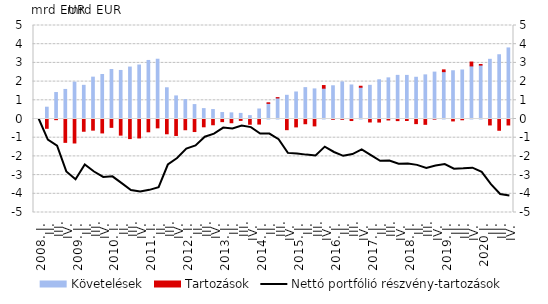
| Category | Követelések | Tartozások |
|---|---|---|
| 2008. I. | 0 | 0 |
|          II. | 0.631 | -0.498 |
|          III. | 1.415 | -0.036 |
|          IV. | 1.581 | -1.249 |
| 2009. I. | 1.969 | -1.283 |
|          II. | 1.8 | -0.655 |
|          III. | 2.238 | -0.596 |
|          IV. | 2.378 | -0.745 |
| 2010. I. | 2.646 | -0.447 |
|          II. | 2.595 | -0.863 |
|          III. | 2.778 | -1.048 |
|          IV. | 2.887 | -1.014 |
| 2011. I. | 3.131 | -0.684 |
|          II. | 3.196 | -0.473 |
|          III. | 1.669 | -0.79 |
|          IV. | 1.235 | -0.881 |
| 2012. I. | 1.037 | -0.575 |
|          II. | 0.771 | -0.671 |
|          III. | 0.556 | -0.417 |
|          IV. | 0.505 | -0.308 |
| 2013. I. | 0.346 | -0.141 |
| II. | 0.328 | -0.2 |
|          III. | 0.299 | -0.075 |
| IV. | 0.181 | -0.281 |
| 2014. I. | 0.534 | -0.271 |
| II. | 0.835 | 0.031 |
|          III. | 1.126 | 0.016 |
| IV. | 1.267 | -0.571 |
| 2015. I. | 1.445 | -0.423 |
| II. | 1.678 | -0.254 |
|          III. | 1.609 | -0.369 |
| IV. | 1.647 | 0.142 |
| 2016. I. | 1.776 | -0.014 |
| II. | 1.981 | -0.014 |
|          III. | 1.819 | -0.082 |
| IV. | 1.699 | 0.052 |
| 2017. I. | 1.801 | -0.159 |
| II. | 2.097 | -0.164 |
|          III. | 2.2 | -0.052 |
| IV. | 2.333 | -0.087 |
| 2018. I. | 2.331 | -0.079 |
| II. | 2.232 | -0.248 |
|          III. | 2.36 | -0.285 |
| IV. | 2.507 | -0.003 |
| 2019. I. | 2.532 | 0.095 |
| II. | 2.579 | -0.103 |
| III. | 2.621 | -0.042 |
| IV. | 2.838 | 0.207 |
| 2020 I. | 2.883 | 0.033 |
| II. | 3.191 | -0.319 |
| III. | 3.436 | -0.603 |
| IV. | 3.8 | -0.32 |